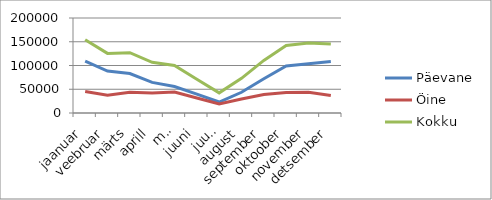
| Category | Päevane | Öine | Kokku |
|---|---|---|---|
| jaanuar | 109001.1 | 45403.5 | 154404.6 |
| veebruar | 88313 | 37156.2 | 125469.2 |
| märts | 83009.7 | 43864.7 | 126874.4 |
| aprill | 64439.4 | 42223.3 | 106662.7 |
| mai | 55879.3 | 44050 | 99929.3 |
| juuni | 39653.9 | 31505.3 | 71159.2 |
| juuli | 23089.6 | 19281.1 | 42370.7 |
| august | 43617.7 | 29404.4 | 73022.1 |
| september | 71970 | 38800 | 110770 |
| oktoober | 98984.7 | 43041.7 | 142026.4 |
| november | 103574.1 | 43736.6 | 147310.7 |
| detsember | 108586.2 | 36732.6 | 145318.8 |